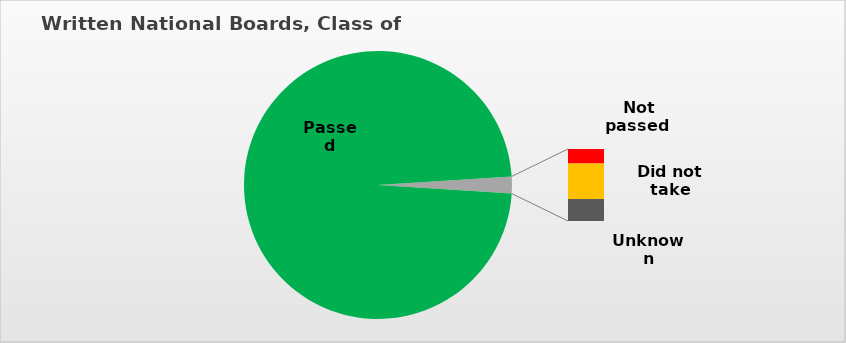
| Category | Series 0 |
|---|---|
| Passed | 0.98 |
| Not passed  | 0.004 |
| Did not take | 0.01 |
| Unknown | 0.006 |